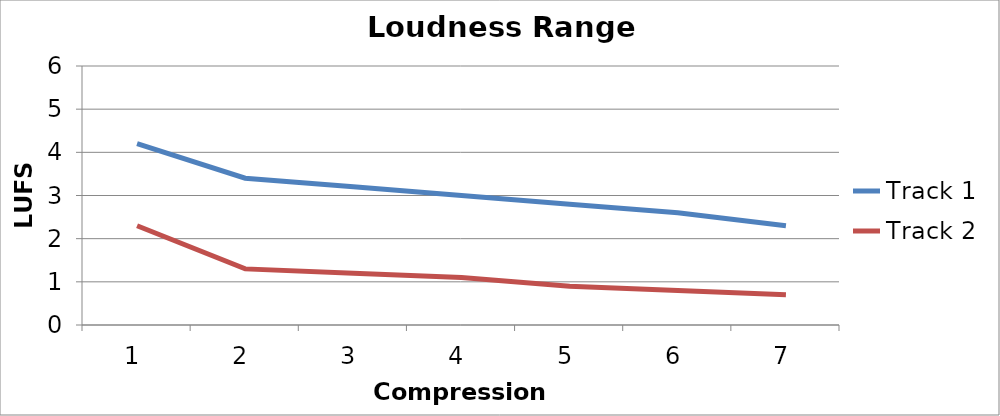
| Category | Track 1 | Track 2 |
|---|---|---|
| 0 | 4.2 | 2.3 |
| 1 | 3.4 | 1.3 |
| 2 | 3.2 | 1.2 |
| 3 | 3 | 1.1 |
| 4 | 2.8 | 0.9 |
| 5 | 2.6 | 0.8 |
| 6 | 2.3 | 0.7 |